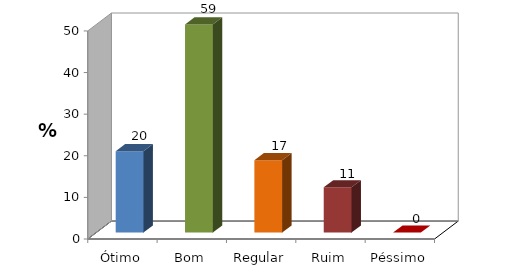
| Category | Series 0 |
|---|---|
| Ótimo | 19.565 |
| Bom | 58.696 |
| Regular | 17.391 |
| Ruim | 10.87 |
| Péssimo | 0 |